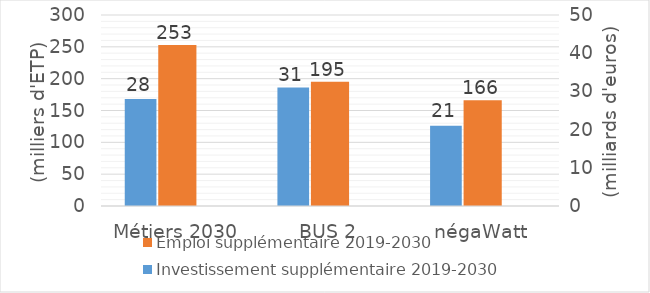
| Category | Emploi supplémentaire 2019-2030 |
|---|---|
| Métiers 2030 | 252.908 |
| BUS 2 | 195 |
| négaWatt | 166 |